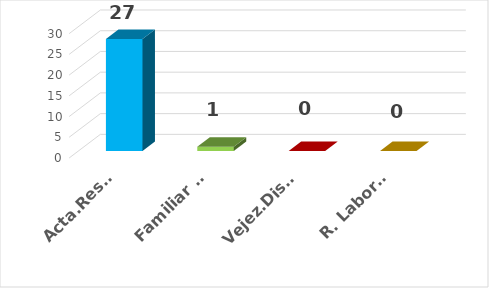
| Category | Series 0 |
|---|---|
| Acta.Res. Doc | 27 |
| Familiar de Salud | 1 |
| Vejez.Disc.Sobrev. | 0 |
| R. Laborales | 0 |